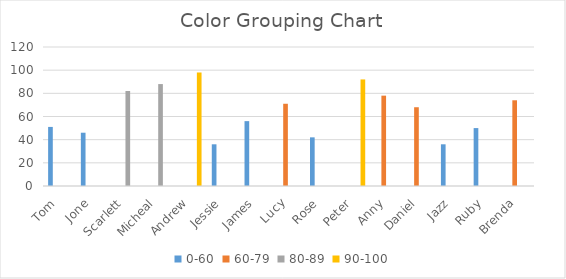
| Category | 0-60 | 60-79 | 80-89 | 90-100 |
|---|---|---|---|---|
| Tom | 51 | 0 | 0 | 0 |
| Jone | 46 | 0 | 0 | 0 |
| Scarlett | 0 | 0 | 82 | 0 |
| Micheal | 0 | 0 | 88 | 0 |
| Andrew | 0 | 0 | 0 | 98 |
| Jessie | 36 | 0 | 0 | 0 |
| James | 56 | 0 | 0 | 0 |
| Lucy | 0 | 71 | 0 | 0 |
| Rose | 42 | 0 | 0 | 0 |
| Peter | 0 | 0 | 0 | 92 |
| Anny | 0 | 78 | 0 | 0 |
| Daniel | 0 | 68 | 0 | 0 |
| Jazz | 36 | 0 | 0 | 0 |
| Ruby | 50 | 0 | 0 | 0 |
| Brenda | 0 | 74 | 0 | 0 |